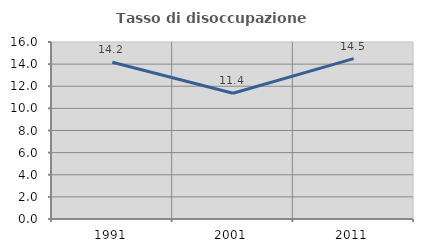
| Category | Tasso di disoccupazione giovanile  |
|---|---|
| 1991.0 | 14.169 |
| 2001.0 | 11.364 |
| 2011.0 | 14.5 |